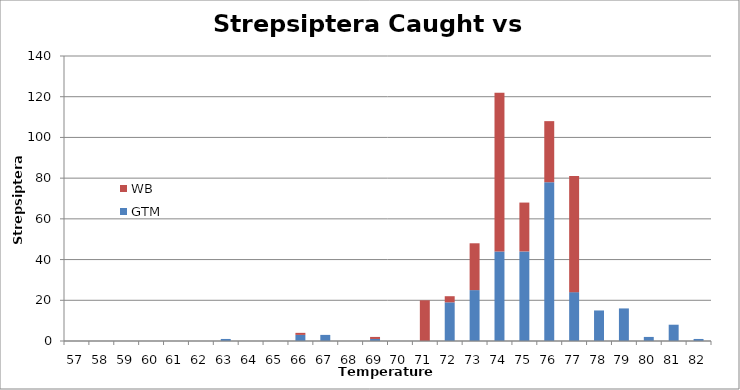
| Category | GTM | WB |
|---|---|---|
| 57.0 | 0 | 0 |
| 58.0 | 0 | 0 |
| 59.0 | 0 | 0 |
| 60.0 | 0 | 0 |
| 61.0 | 0 | 0 |
| 62.0 | 0 | 0 |
| 63.0 | 1 | 0 |
| 64.0 | 0 | 0 |
| 65.0 | 0 | 0 |
| 66.0 | 3 | 1 |
| 67.0 | 3 | 0 |
| 68.0 | 0 | 0 |
| 69.0 | 1 | 1 |
| 70.0 | 0 | 0 |
| 71.0 | 0 | 20 |
| 72.0 | 19 | 3 |
| 73.0 | 25 | 23 |
| 74.0 | 44 | 78 |
| 75.0 | 44 | 24 |
| 76.0 | 78 | 30 |
| 77.0 | 24 | 57 |
| 78.0 | 15 | 0 |
| 79.0 | 16 | 0 |
| 80.0 | 2 | 0 |
| 81.0 | 8 | 0 |
| 82.0 | 1 | 0 |